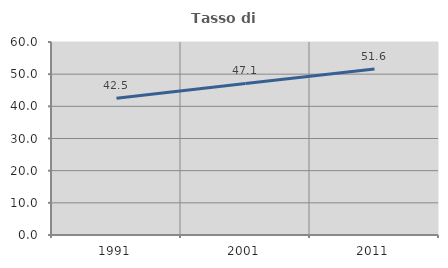
| Category | Tasso di occupazione   |
|---|---|
| 1991.0 | 42.482 |
| 2001.0 | 47.122 |
| 2011.0 | 51.629 |